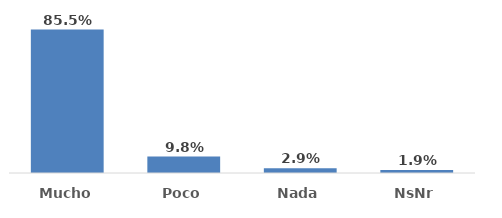
| Category | Series 0 |
|---|---|
| Mucho  | 0.855 |
| Poco | 0.098 |
| Nada | 0.029 |
| NsNr | 0.019 |